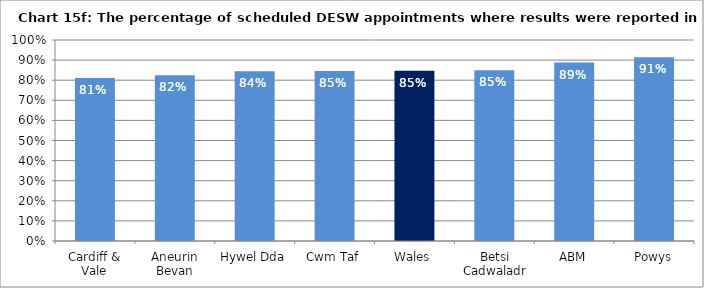
| Category | Chart 15f: The percentage of scheduled DESW appointments where results were reported in 2016-17 |
|---|---|
| Cardiff & Vale | 0.811 |
| Aneurin Bevan | 0.824 |
| Hywel Dda | 0.844 |
| Cwm Taf | 0.846 |
| Wales | 0.848 |
| Betsi Cadwaladr | 0.85 |
| ABM | 0.888 |
| Powys | 0.915 |